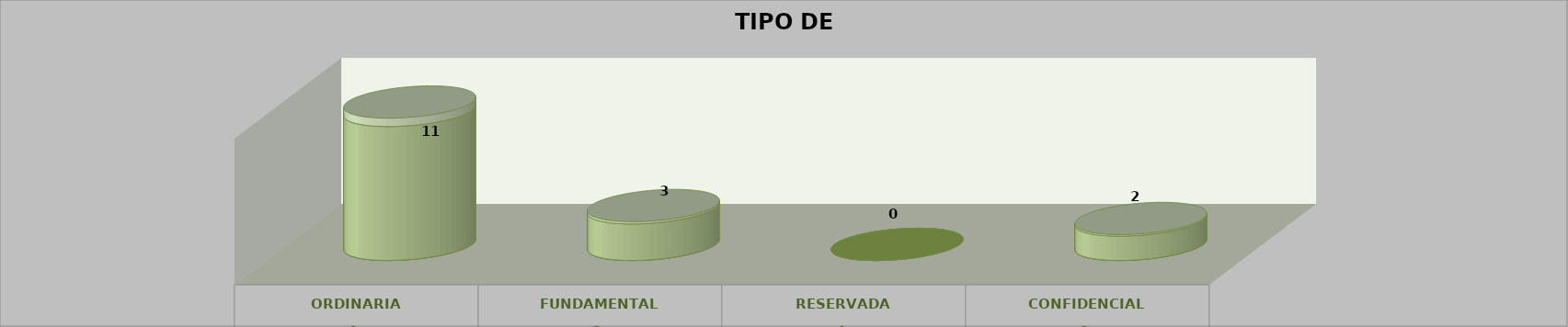
| Category | Series 0 | Series 2 | Series 1 | Series 3 | Series 4 |
|---|---|---|---|---|---|
| 0 |  |  |  | 11 | 0.688 |
| 1 |  |  |  | 3 | 0.188 |
| 2 |  |  |  | 0 | 0 |
| 3 |  |  |  | 2 | 0.125 |